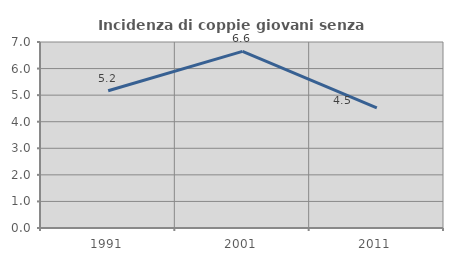
| Category | Incidenza di coppie giovani senza figli |
|---|---|
| 1991.0 | 5.167 |
| 2001.0 | 6.647 |
| 2011.0 | 4.523 |